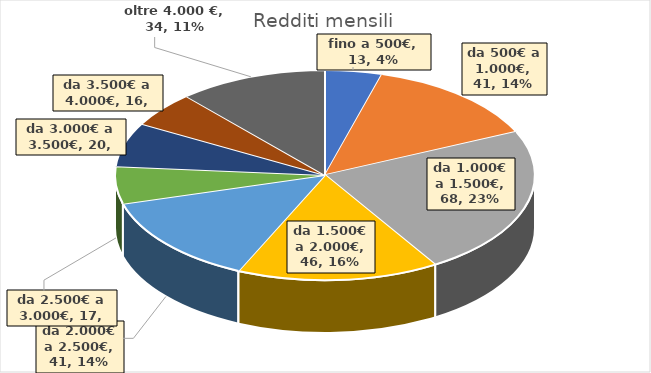
| Category | Series 0 |
|---|---|
| fino a 500€ | 13 |
| da 500€ a 1.000€ | 41 |
| da 1.000€ a 1.500€ | 68 |
| da 1.500€ a 2.000€ | 46 |
| da 2.000€ a 2.500€ | 41 |
| da 2.500€ a 3.000€ | 17 |
| da 3.000€ a 3.500€ | 20 |
| da 3.500€ a 4.000€ | 16 |
| oltre 4.000 € | 34 |